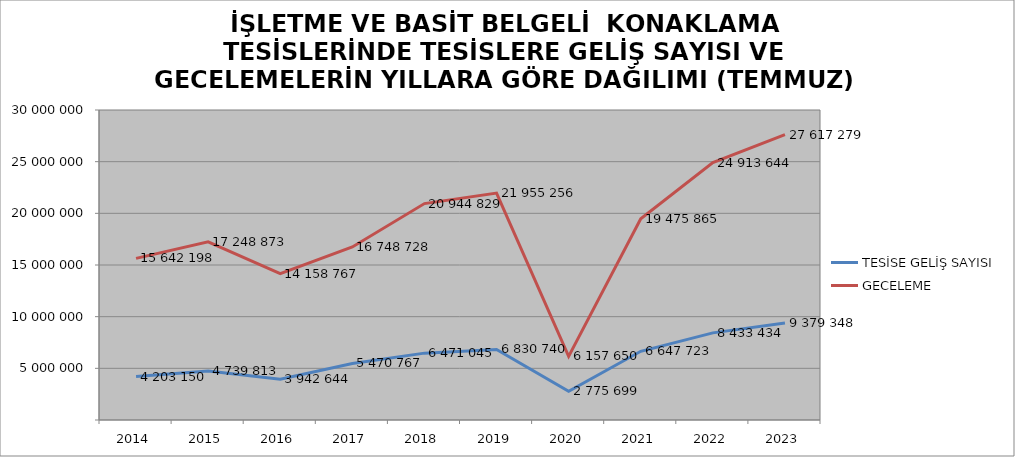
| Category | TESİSE GELİŞ SAYISI | GECELEME |
|---|---|---|
| 2014 | 4203150 | 15642198 |
| 2015 | 4739813 | 17248873 |
| 2016 | 3942644 | 14158767 |
| 2017 | 5470767 | 16748728 |
| 2018 | 6471045 | 20944829 |
| 2019 | 6830740 | 21955256 |
| 2020 | 2775699 | 6157650 |
| 2021 | 6647723 | 19475865 |
| 2022 | 8433434 | 24913644 |
| 2023 | 9379348 | 27617279 |